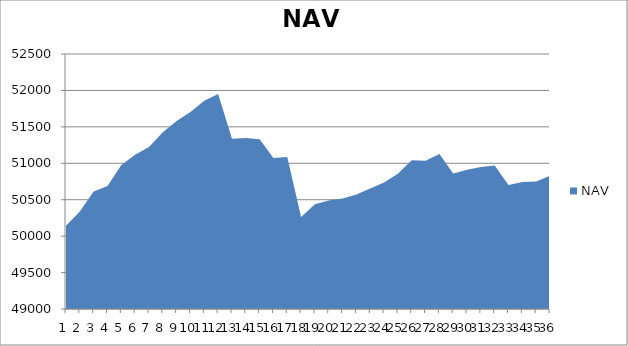
| Category | NAV |
|---|---|
| 0 | 50142.343 |
| 1 | 50336.57 |
| 2 | 50612.255 |
| 3 | 50687.913 |
| 4 | 50975.413 |
| 5 | 51115.874 |
| 6 | 51223.542 |
| 7 | 51427.364 |
| 8 | 51580.567 |
| 9 | 51704.692 |
| 10 | 51858.016 |
| 11 | 51951.766 |
| 12 | 51336.067 |
| 13 | 51345.356 |
| 14 | 51328.667 |
| 15 | 51072.985 |
| 16 | 51085.199 |
| 17 | 50261.67 |
| 18 | 50438.394 |
| 19 | 50489.896 |
| 20 | 50518.251 |
| 21 | 50572.468 |
| 22 | 50655.55 |
| 23 | 50737.787 |
| 24 | 50856.035 |
| 25 | 51041.806 |
| 26 | 51034.925 |
| 27 | 51128.589 |
| 28 | 50859.456 |
| 29 | 50911.137 |
| 30 | 50950.007 |
| 31 | 50970.175 |
| 32 | 50701.326 |
| 33 | 50743.495 |
| 34 | 50751.546 |
| 35 | 50826.725 |